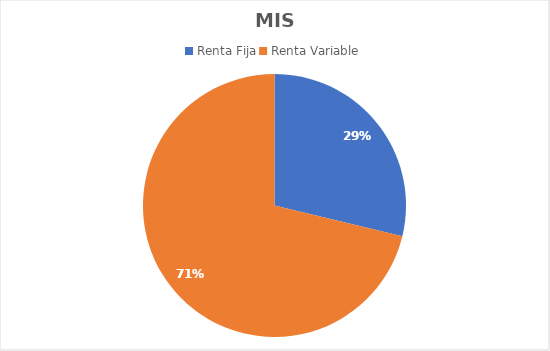
| Category | Series 0 |
|---|---|
| Renta Fija | 1050 |
| Renta Variable | 2599.6 |